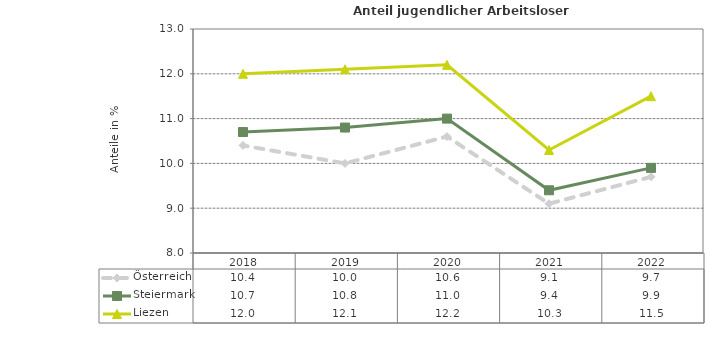
| Category | Österreich | Steiermark | Liezen |
|---|---|---|---|
| 2022.0 | 9.7 | 9.9 | 11.5 |
| 2021.0 | 9.1 | 9.4 | 10.3 |
| 2020.0 | 10.6 | 11 | 12.2 |
| 2019.0 | 10 | 10.8 | 12.1 |
| 2018.0 | 10.4 | 10.7 | 12 |